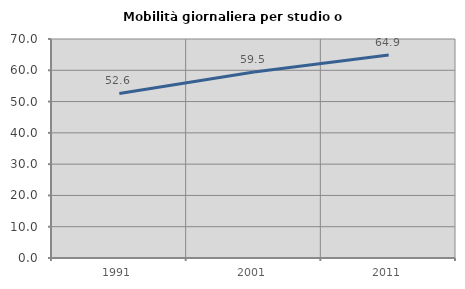
| Category | Mobilità giornaliera per studio o lavoro |
|---|---|
| 1991.0 | 52.582 |
| 2001.0 | 59.473 |
| 2011.0 | 64.877 |